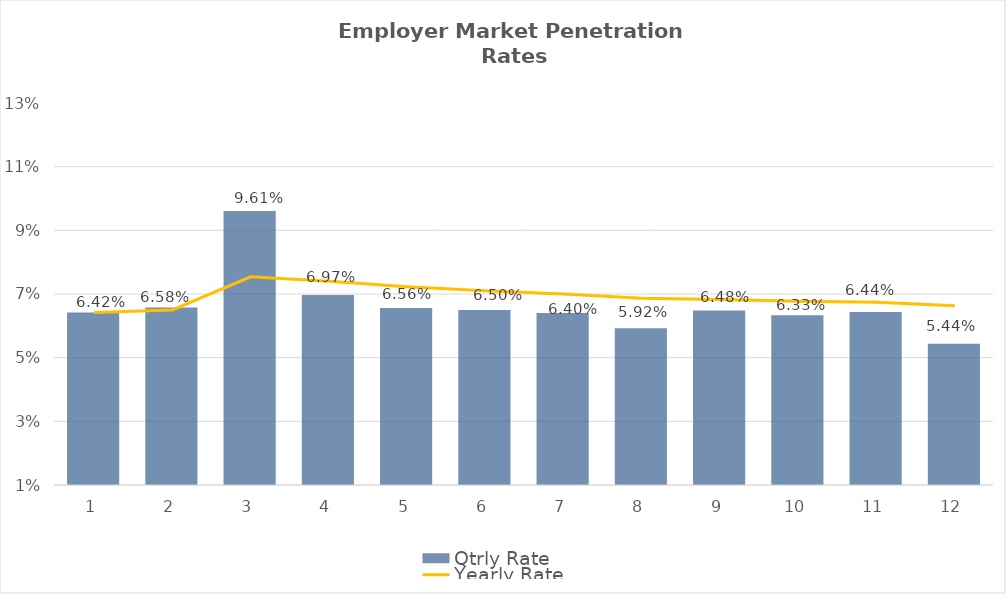
| Category | Qtrly Rate |
|---|---|
| 0 | 0.064 |
| 1 | 0.066 |
| 2 | 0.096 |
| 3 | 0.07 |
| 4 | 0.066 |
| 5 | 0.065 |
| 6 | 0.064 |
| 7 | 0.059 |
| 8 | 0.065 |
| 9 | 0.063 |
| 10 | 0.064 |
| 11 | 0.054 |